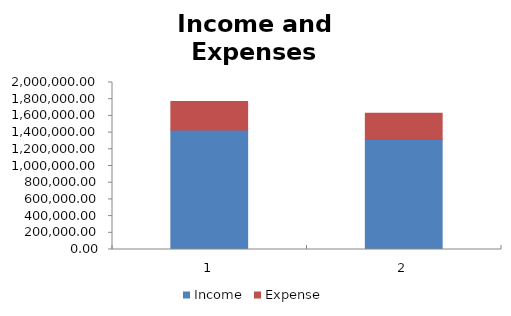
| Category | Income | Expense | Series 2 |
|---|---|---|---|
| 0 | 1432500 | 339760 |  |
| 1 | 1318080 | 314910 |  |